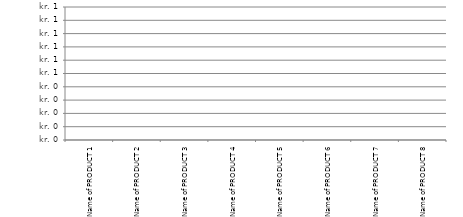
| Category | Cost of purchase DKK | Cost of operation DKK |
|---|---|---|
| Name of PRODUCT 1 | 0 | 0 |
| Name of PRODUCT 2 | 0 | 0 |
| Name of PRODUCT 3 | 0 | 0 |
| Name of PRODUCT 4 | 0 | 0 |
| Name of PRODUCT 5 | 0 | 0 |
| Name of PRODUCT 6 | 0 | 0 |
| Name of PRODUCT 7 | 0 | 0 |
| Name of PRODUCT 8 | 0 | 0 |